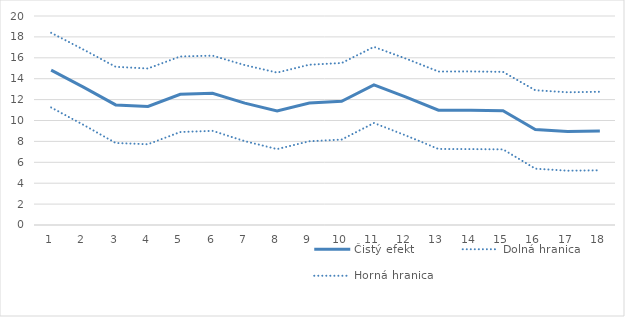
| Category | Čistý efekt | Dolná hranica | Horná hranica |
|---|---|---|---|
| 1.0 | 14.817 | 11.244 | 18.389 |
| 2.0 | 13.187 | 9.583 | 16.79 |
| 3.0 | 11.492 | 7.848 | 15.137 |
| 4.0 | 11.352 | 7.727 | 14.977 |
| 5.0 | 12.512 | 8.897 | 16.128 |
| 6.0 | 12.608 | 9.01 | 16.207 |
| 7.0 | 11.662 | 8.024 | 15.299 |
| 8.0 | 10.922 | 7.262 | 14.582 |
| 9.0 | 11.676 | 8.014 | 15.339 |
| 10.0 | 11.838 | 8.174 | 15.501 |
| 11.0 | 13.402 | 9.761 | 17.044 |
| 12.0 | 12.234 | 8.555 | 15.912 |
| 13.0 | 10.981 | 7.276 | 14.687 |
| 14.0 | 10.98 | 7.264 | 14.695 |
| 15.0 | 10.945 | 7.236 | 14.653 |
| 16.0 | 9.144 | 5.393 | 12.895 |
| 17.0 | 8.948 | 5.197 | 12.7 |
| 18.0 | 8.991 | 5.233 | 12.749 |